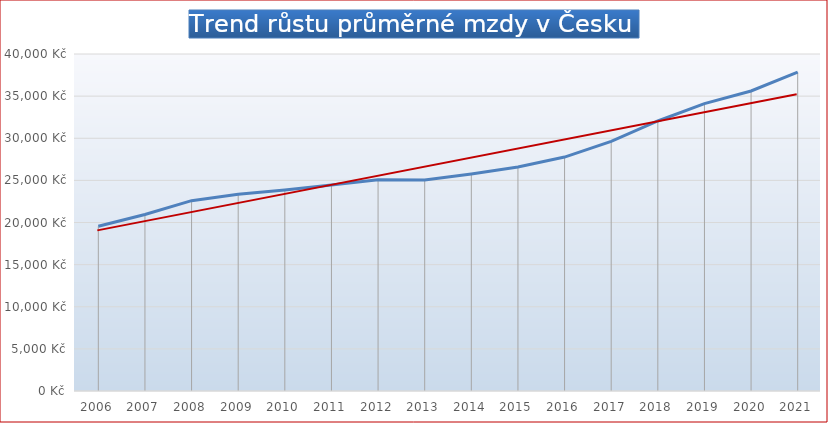
| Category | Series 0 |
|---|---|
| 2006.0 | 19546 |
| 2007.0 | 20957 |
| 2008.0 | 22592 |
| 2009.0 | 23344 |
| 2010.0 | 23864 |
| 2011.0 | 24455 |
| 2012.0 | 25067 |
| 2013.0 | 25035 |
| 2014.0 | 25768 |
| 2015.0 | 26591 |
| 2016.0 | 27764 |
| 2017.0 | 29638 |
| 2018.0 | 32051 |
| 2019.0 | 34111 |
| 2020.0 | 35611 |
| 2021.0 | 37839 |